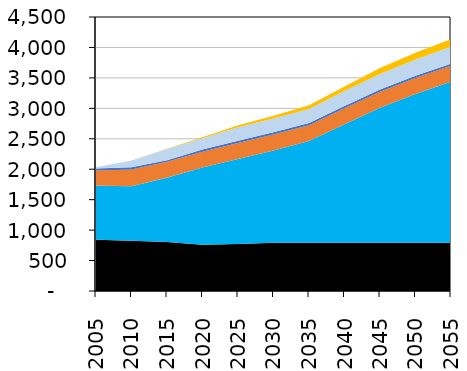
| Category | Series 1 | Series 0 | Series 2 | Series 3 | Series 4 | Series 5 | Series 6 | Series 7 | Series 8 | Series 9 | Series 10 | Series 11 | Series 12 |
|---|---|---|---|---|---|---|---|---|---|---|---|---|---|
| 2005.0 | 0 | 840.12 | 0 | 888.71 | 5.16 | 245.79 | 0 | 0 | 0.72 | 0 | 31.03 | 21.55 | 0 |
| 2010.0 | 0 | 825.1 | 0 | 893.77 | 0.73 | 275.39 | 0 | 0 | 0.72 | 0 | 36.33 | 110.37 | 0.02 |
| 2015.0 | 0 | 803.5 | 0 | 1058.2 | 0.51 | 261.01 | 0 | 0 | 0.72 | 0 | 25.04 | 184.36 | 3.24 |
| 2020.0 | 0 | 758.92 | 0 | 1267.61 | 0 | 261 | 0 | 0 | 0.72 | 0 | 36.33 | 184.36 | 17.33 |
| 2025.0 | 0 | 773.81 | 0 | 1394.09 | 0 | 261 | 0 | 0.06 | 0.72 | 0 | 36.33 | 225.03 | 31.4 |
| 2030.0 | 0 | 794.43 | 0 | 1513.04 | 0 | 261 | 0 | 0 | 0.72 | 0 | 36.33 | 226.79 | 45.49 |
| 2035.0 | 0 | 794.43 | 0 | 1667.95 | 0 | 261 | 0 | 0 | 0.72 | 0 | 36.33 | 230.23 | 59.56 |
| 2040.0 | 0 | 794.43 | 0 | 1944.08 | 0 | 261 | 0 | 0 | 0.72 | 0 | 36.33 | 247.38 | 73.65 |
| 2045.0 | 0 | 794.43 | 0 | 2216.8 | 0 | 261.01 | 0 | 0 | 0.72 | 0 | 36.33 | 254.96 | 96.91 |
| 2050.0 | 0 | 794.43 | 0 | 2441.47 | 0 | 261.01 | 0 | 0 | 0 | 0 | 36.33 | 267 | 110.98 |
| 2055.0 | 0 | 794.43 | 0 | 2643.82 | 0 | 261.01 | 0 | 0 | 0 | 0 | 36.33 | 275.81 | 125.07 |